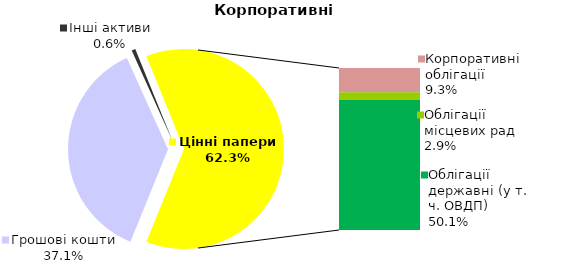
| Category | Корпоративні |
|---|---|
| Грошові кошти | 138.385 |
| Банківські метали | 0 |
| Нерухомість | 0 |
| Інші активи | 2.293 |
| Акції | 0 |
| Корпоративні облігації | 34.841 |
| Облігації місцевих рад | 10.666 |
| Облігації державні (у т. ч. ОВДП) | 186.639 |